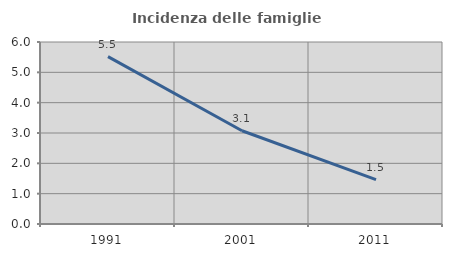
| Category | Incidenza delle famiglie numerose |
|---|---|
| 1991.0 | 5.519 |
| 2001.0 | 3.074 |
| 2011.0 | 1.463 |